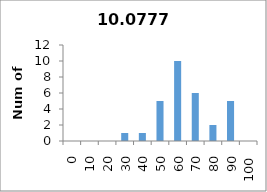
| Category | Series 0 |
|---|---|
| 0.0 | 0 |
| 10.0 | 0 |
| 20.0 | 0 |
| 30.0 | 1 |
| 40.0 | 1 |
| 50.0 | 5 |
| 60.0 | 10 |
| 70.0 | 6 |
| 80.0 | 2 |
| 90.0 | 5 |
| 100.0 | 0 |